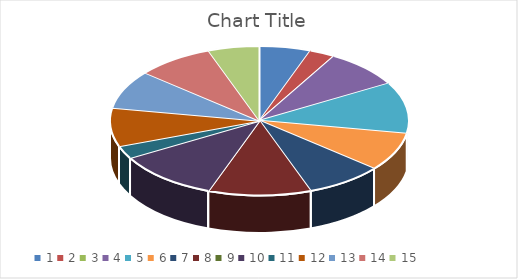
| Category | Series 0 | Series 1 | Series 2 |
|---|---|---|---|
| 0 | 2 | 2 | 0 |
| 1 | 1 | 4 | 3 |
| 2 | 0 | 1 | 1 |
| 3 | 3 | 3 | 1 |
| 4 | 4 | 2 | 0 |
| 5 | 3 | 2 | 1 |
| 6 | 3 | 3 | 3 |
| 7 | 4 | 1 | 1 |
| 8 | 0 | 2 | 2 |
| 9 | 4 | 0 | 2 |
| 10 | 1 | 3 | 4 |
| 11 | 3 | 0 | 1 |
| 12 | 3 | 4 | 2 |
| 13 | 3 | 3 | 2 |
| 14 | 2 | 3 | 3 |